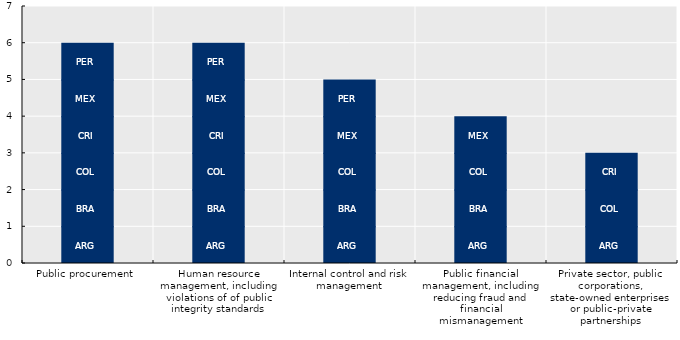
| Category | ARG | BRA | CHL | COL | CRI | MEX | PER |
|---|---|---|---|---|---|---|---|
| Public procurement | 1 | 1 | 0 | 1 | 1 | 1 | 1 |
| Human resource management, including violations of of public integrity standards | 1 | 1 | 0 | 1 | 1 | 1 | 1 |
| Internal control and risk management | 1 | 1 | 0 | 1 | 0 | 1 | 1 |
| Public financial management, including reducing fraud and financial mismanagement | 1 | 1 | 0 | 1 | 0 | 1 | 0 |
| Private sector, public corporations, state-owned enterprises or public-private partnerships | 1 | 0 | 0 | 1 | 1 | 0 | 0 |